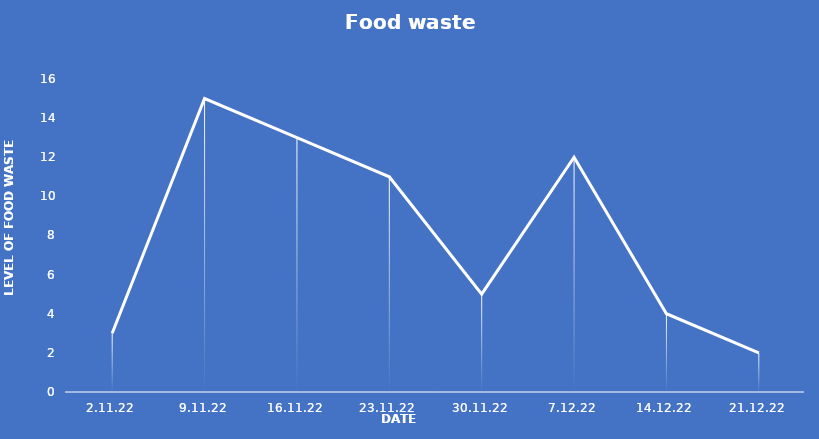
| Category | Food waste (kg) |
|---|---|
| 2.11.22 | 3 |
| 9.11.22 | 15 |
| 16.11.22 | 13 |
| 23.11.22 | 11 |
| 30.11.22 | 5 |
| 7.12.22 | 12 |
| 14.12.22 | 4 |
| 21.12.22 | 2 |